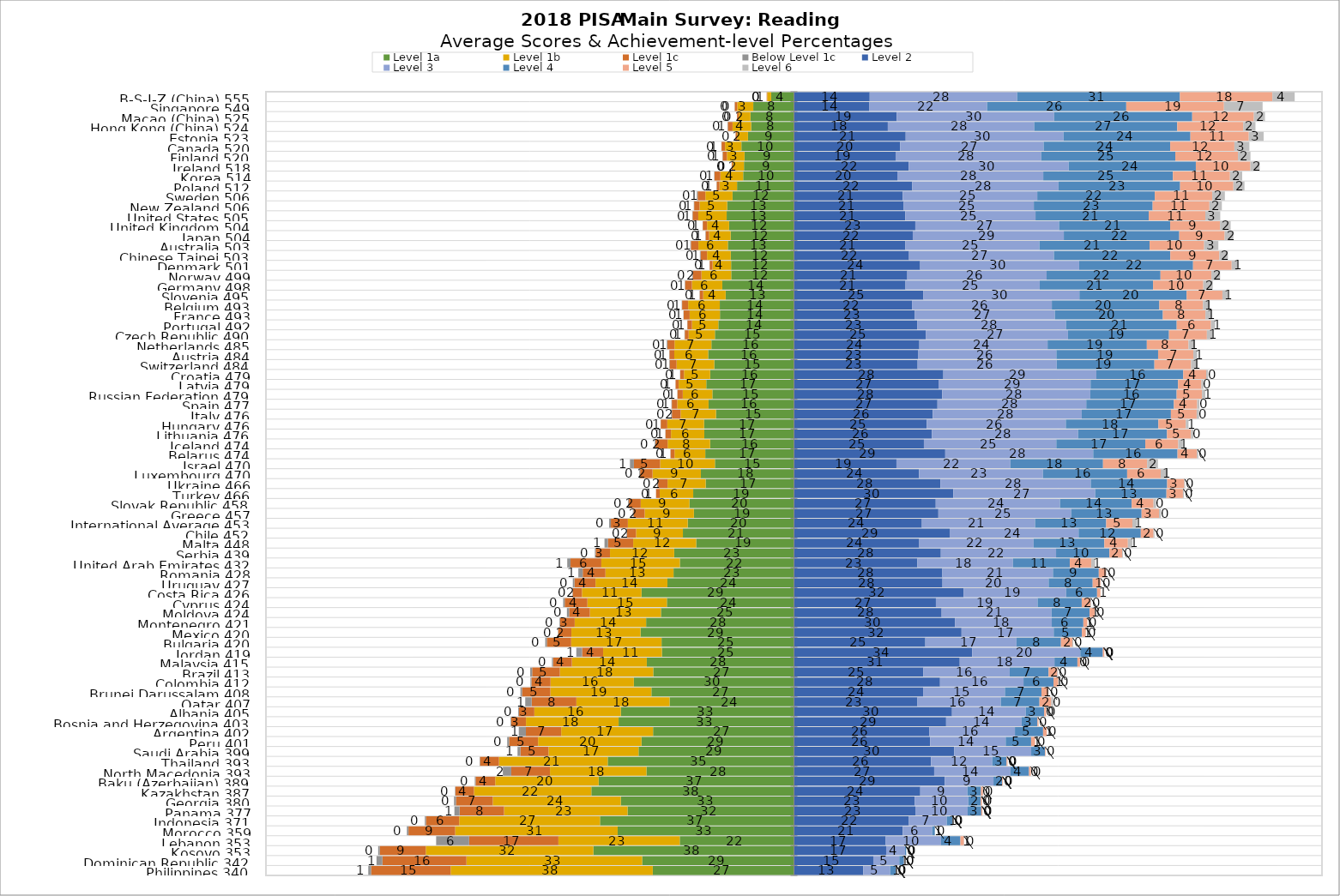
| Category | Level 1a | Level 1b | Level 1c    | Below Level 1c | Level 2 | Level 3 | Level 4 | Level 5 | Level 6 |
|---|---|---|---|---|---|---|---|---|---|
| Philippines 340 | -26.744 | -38.264 | -15.083 | -0.532 | 13.13 | 5.095 | 1.1 | 0.051 | 0.002 |
| Dominican Republic 342 | -28.753 | -33.268 | -15.922 | -1.115 | 15.027 | 4.92 | 0.896 | 0.095 | 0.001 |
| Kosovo 353 | -37.993 | -31.733 | -8.719 | -0.301 | 17.464 | 3.569 | 0.219 | 0.001 | 0 |
| Lebanon 353 | -21.636 | -22.978 | -16.906 | -6.25 | 17.385 | 10.465 | 3.669 | 0.675 | 0.036 |
| Morocco 359 | -33.393 | -30.763 | -8.845 | -0.308 | 20.604 | 5.57 | 0.511 | 0.006 | 0 |
| Indonesia 371 | -36.739 | -26.667 | -6.294 | -0.209 | 21.771 | 7.17 | 1.09 | 0.06 | 0.001 |
| Panama 377 | -31.527 | -23.378 | -8.432 | -0.974 | 22.993 | 9.91 | 2.576 | 0.208 | 0.003 |
| Georgia 380 | -32.794 | -24.242 | -6.976 | -0.364 | 22.891 | 10.135 | 2.363 | 0.227 | 0.009 |
| Kazakhstan 387 | -38.379 | -22.226 | -3.505 | -0.08 | 23.921 | 8.939 | 2.558 | 0.367 | 0.025 |
| Baku (Azerbaijan) 389 | -36.993 | -19.584 | -3.724 | -0.149 | 28.562 | 9.226 | 1.622 | 0.131 | 0.01 |
| North Macedonia 393 | -27.943 | -18.263 | -7.335 | -1.596 | 26.557 | 14.443 | 3.516 | 0.334 | 0.014 |
| Thailand 393 | -35.28 | -20.585 | -3.598 | -0.081 | 25.965 | 11.588 | 2.718 | 0.184 | 0.001 |
| Saudi Arabia 399 | -29.439 | -17.045 | -5.328 | -0.543 | 30.353 | 14.575 | 2.604 | 0.113 | 0 |
| Peru 401 | -28.877 | -19.585 | -5.495 | -0.354 | 25.807 | 14.29 | 4.811 | 0.748 | 0.034 |
| Argentina 402 | -26.691 | -17.391 | -6.687 | -1.347 | 25.664 | 16.185 | 5.331 | 0.678 | 0.026 |
| Bosnia and Herzegovina 403 | -33.211 | -17.542 | -2.799 | -0.123 | 28.815 | 14.305 | 2.994 | 0.211 | 0 |
| Albania 405 | -32.781 | -16.389 | -2.924 | -0.141 | 29.933 | 13.963 | 3.493 | 0.367 | 0.008 |
| Qatar 407 | -23.563 | -17.646 | -8.465 | -1.22 | 23.393 | 15.785 | 7.317 | 2.233 | 0.376 |
| Brunei Darussalam 408 | -27.003 | -19.128 | -5.373 | -0.298 | 24.464 | 15.493 | 6.919 | 1.283 | 0.039 |
| Colombia 412 | -30.325 | -15.779 | -3.627 | -0.172 | 27.663 | 15.812 | 5.676 | 0.911 | 0.035 |
| Brazil 413 | -26.657 | -17.678 | -5.25 | -0.369 | 24.519 | 16.334 | 7.366 | 1.658 | 0.169 |
| Malaysia 415 | -27.873 | -14.189 | -3.568 | -0.203 | 31.395 | 17.94 | 4.348 | 0.475 | 0.009 |
| Jordan 419 | -25.017 | -11.127 | -3.988 | -1.093 | 33.767 | 20.463 | 4.272 | 0.269 | 0.004 |
| Bulgaria 420 | -25.077 | -17.116 | -4.607 | -0.303 | 24.88 | 17.255 | 8.422 | 2.157 | 0.183 |
| Mexico 420 | -29.054 | -13.099 | -2.494 | -0.046 | 31.735 | 17.459 | 5.339 | 0.747 | 0.026 |
| Montenegro 421 | -28.003 | -13.527 | -2.778 | -0.112 | 30.49 | 18.336 | 5.98 | 0.756 | 0.019 |
| Moldova 424 | -25.198 | -13.452 | -3.939 | -0.411 | 27.968 | 20.816 | 7.204 | 0.967 | 0.046 |
| Cyprus 424 | -24.072 | -15.046 | -4.301 | -0.29 | 26.882 | 19.256 | 8.36 | 1.68 | 0.114 |
| Costa Rica 426 | -28.871 | -11.283 | -1.755 | -0.056 | 32.105 | 19.439 | 5.862 | 0.629 | 0 |
| Uruguay 427 | -23.966 | -13.618 | -3.995 | -0.305 | 28.13 | 20.105 | 8.337 | 1.478 | 0.066 |
| Romania 428 | -22.808 | -12.893 | -4.311 | -0.827 | 28.106 | 20.941 | 8.683 | 1.34 | 0.092 |
| United Arab Emirates 432 | -21.618 | -14.866 | -5.834 | -0.622 | 23.383 | 18.09 | 10.772 | 4.065 | 0.75 |
| Serbia 439 | -22.684 | -12.16 | -2.72 | -0.141 | 27.818 | 21.823 | 10.107 | 2.397 | 0.151 |
| Malta 448 | -18.525 | -11.926 | -4.783 | -0.652 | 23.731 | 21.66 | 13.387 | 4.468 | 0.867 |
| Chile 452 | -21.035 | -8.868 | -1.718 | -0.1 | 29.487 | 24.419 | 11.779 | 2.41 | 0.184 |
| International Average 453 | -20.129 | -11.328 | -3.221 | -0.323 | 24.228 | 21.437 | 13.468 | 4.958 | 0.907 |
| Greece 457 | -18.953 | -9.323 | -2.119 | -0.121 | 27.348 | 25.152 | 13.335 | 3.311 | 0.339 |
| Slovak Republic 458 | -19.796 | -9.224 | -2.25 | -0.14 | 26.852 | 23.532 | 13.572 | 4.145 | 0.49 |
| Turkey 466 | -19.084 | -6.345 | -0.689 | -0.014 | 30.174 | 26.877 | 13.489 | 3.127 | 0.201 |
| Ukraine 466 | -16.729 | -7.213 | -1.796 | -0.168 | 27.728 | 28.481 | 14.469 | 3.244 | 0.172 |
| Luxembourg 470 | -17.631 | -9.156 | -2.353 | -0.151 | 23.692 | 23.463 | 15.948 | 6.355 | 1.251 |
| Israel 470 | -14.975 | -10.373 | -4.966 | -0.748 | 19.409 | 21.579 | 17.543 | 8.358 | 2.048 |
| Belarus 474 | -16.798 | -5.824 | -0.751 | -0.036 | 28.651 | 28.022 | 15.969 | 3.671 | 0.278 |
| Iceland 474 | -15.882 | -8.039 | -2.313 | -0.123 | 24.609 | 25.074 | 16.855 | 6.245 | 0.861 |
| Lithuania 476 | -16.98 | -6.307 | -1.042 | -0.034 | 26.108 | 27.696 | 16.852 | 4.532 | 0.45 |
| Hungary 476 | -17.028 | -6.962 | -1.248 | -0.036 | 25.162 | 26.324 | 17.532 | 5.198 | 0.511 |
| Italy 476 | -14.773 | -6.692 | -1.654 | -0.148 | 26.287 | 28.214 | 16.887 | 4.879 | 0.466 |
| Spain 477 | -16.175 | -5.931 | -1.026 | -0.07 | 27.176 | 28.181 | 16.594 | 4.422 | 0.426 |
| Russian Federation 479 | -15.456 | -5.602 | -1.003 | -0.031 | 28.086 | 28.035 | 16.353 | 4.812 | 0.62 |
| Latvia 479 | -16.613 | -5.219 | -0.59 | -0.021 | 27.379 | 28.794 | 16.565 | 4.422 | 0.397 |
| Croatia 479 | -15.87 | -4.963 | -0.709 | -0.037 | 28.292 | 28.98 | 16.444 | 4.349 | 0.356 |
| Switzerland 484 | -15.103 | -7.123 | -1.312 | -0.096 | 23.421 | 26.335 | 18.511 | 6.946 | 1.154 |
| Austria 484 | -16.258 | -6.407 | -0.919 | -0.039 | 23.484 | 26.211 | 19.27 | 6.672 | 0.739 |
| Netherlands 485 | -15.639 | -6.981 | -1.335 | -0.132 | 23.748 | 24.286 | 18.797 | 7.894 | 1.188 |
| Czech Republic 490 | -14.979 | -4.963 | -0.736 | -0.062 | 24.957 | 26.936 | 19.13 | 7.184 | 1.052 |
| Portugal 492 | -14.33 | -4.979 | -0.875 | -0.038 | 23.332 | 28.179 | 20.975 | 6.491 | 0.801 |
| France 493 | -14.022 | -5.737 | -1.133 | -0.045 | 22.846 | 26.567 | 20.453 | 8.061 | 1.137 |
| Belgium 493 | -14.047 | -5.992 | -1.151 | -0.065 | 22.356 | 26.483 | 20.361 | 8.265 | 1.282 |
| Slovenia 495 | -12.941 | -4.25 | -0.644 | -0.045 | 24.524 | 29.535 | 20.307 | 6.778 | 0.975 |
| Germany 498 | -13.573 | -5.747 | -1.303 | -0.061 | 21.13 | 25.406 | 21.473 | 9.51 | 1.796 |
| Norway 499 | -11.887 | -5.635 | -1.656 | -0.115 | 21.466 | 26.379 | 21.572 | 9.642 | 1.647 |
| Denmark 501 | -11.907 | -3.513 | -0.549 | -0.031 | 23.901 | 30.107 | 21.577 | 7.312 | 1.103 |
| Chinese Taipei 503 | -11.97 | -4.492 | -1.22 | -0.132 | 21.792 | 27.445 | 22.041 | 9.289 | 1.618 |
| Australia 503 | -12.53 | -5.572 | -1.421 | -0.104 | 21.111 | 25.375 | 20.868 | 10.33 | 2.688 |
| Japan 504 | -11.994 | -4.078 | -0.65 | -0.057 | 22.499 | 28.609 | 21.863 | 8.597 | 1.654 |
| United Kingdom 504 | -12.285 | -4.173 | -0.817 | -0.028 | 22.981 | 27.219 | 21.045 | 9.451 | 2 |
| United States 505 | -12.748 | -5.374 | -1.073 | -0.071 | 21.09 | 24.657 | 21.446 | 10.709 | 2.831 |
| New Zealand 506 | -12.659 | -5.224 | -1.018 | -0.062 | 20.795 | 24.636 | 22.502 | 10.75 | 2.354 |
| Sweden 506 | -11.637 | -5.141 | -1.462 | -0.153 | 20.606 | 25.473 | 22.255 | 10.884 | 2.389 |
| Poland 512 | -10.783 | -3.324 | -0.523 | -0.046 | 22.408 | 27.688 | 23.035 | 10.084 | 2.109 |
| Korea 514 | -9.623 | -4.312 | -1.108 | -0.065 | 19.579 | 27.635 | 24.555 | 10.805 | 2.318 |
| Ireland 518 | -9.474 | -2.111 | -0.213 | -0.001 | 21.742 | 30.291 | 24.079 | 10.329 | 1.759 |
| Finland 520 | -9.37 | -3.326 | -0.8 | -0.048 | 19.249 | 27.583 | 25.389 | 11.871 | 2.363 |
| Canada 520 | -9.955 | -3.1 | -0.659 | -0.036 | 20.119 | 27.165 | 23.973 | 12.154 | 2.839 |
| Estonia 523 | -8.71 | -2.059 | -0.285 | 0 | 21.16 | 29.896 | 24.031 | 11.053 | 2.806 |
| Hong Kong (China) 524 | -8.111 | -3.521 | -0.893 | -0.073 | 17.778 | 27.718 | 27.097 | 12.497 | 2.312 |
| Macao (China) 525 | -8.234 | -2.218 | -0.329 | -0.021 | 19.449 | 29.827 | 26.148 | 11.672 | 2.101 |
| Singapore 549 | -7.707 | -3.037 | -0.464 | -0.039 | 14.229 | 22.347 | 26.356 | 18.506 | 7.314 |
| B-S-J-Z (China) 555 | -4.322 | -0.743 | -0.103 | 0 | 14.343 | 27.925 | 30.825 | 17.51 | 4.229 |